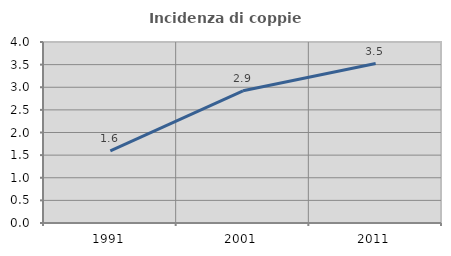
| Category | Incidenza di coppie miste |
|---|---|
| 1991.0 | 1.595 |
| 2001.0 | 2.922 |
| 2011.0 | 3.524 |